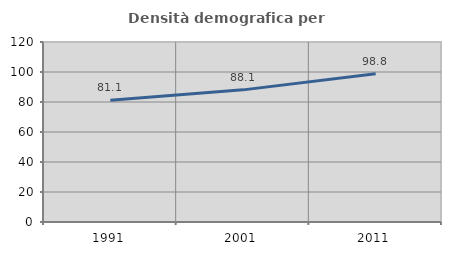
| Category | Densità demografica |
|---|---|
| 1991.0 | 81.147 |
| 2001.0 | 88.089 |
| 2011.0 | 98.78 |